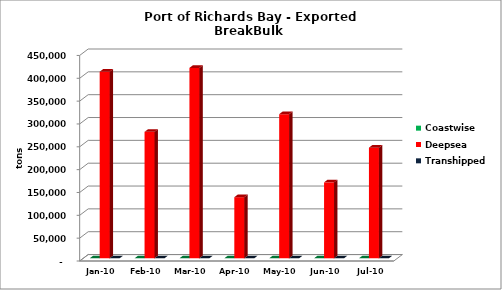
| Category | Coastwise | Deepsea | Series 2 | Transhipped |
|---|---|---|---|---|
| 2010-01-01 | 0 | 408552 |  | 0 |
| 2010-02-01 | 0 | 276795 |  | 0 |
| 2010-03-01 | 0 | 416805 |  | 0 |
| 2010-04-01 | 0 | 133759 |  | 0 |
| 2010-05-01 | 0 | 315555 |  | 0 |
| 2010-06-01 | 0 | 166211 |  | 0 |
| 2010-07-01 | 0 | 242262 |  | 0 |